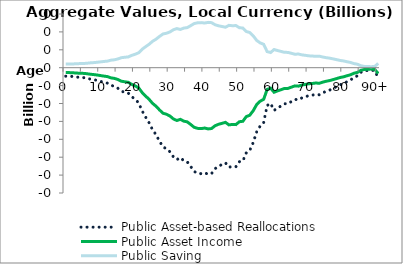
| Category | Public Asset-based Reallocations | Public Asset Income | Public Saving |
|---|---|---|---|
| 0 | -0.949 | -0.545 | 0.404 |
|  | -0.954 | -0.548 | 0.406 |
| 2 | -0.982 | -0.564 | 0.418 |
| 3 | -1.036 | -0.596 | 0.441 |
| 4 | -1.077 | -0.619 | 0.458 |
| 5 | -1.102 | -0.633 | 0.469 |
| 6 | -1.157 | -0.665 | 0.492 |
| 7 | -1.265 | -0.727 | 0.538 |
| 8 | -1.332 | -0.765 | 0.566 |
| 9 | -1.418 | -0.815 | 0.603 |
| 10 | -1.529 | -0.879 | 0.651 |
| 11 | -1.636 | -0.94 | 0.696 |
| 12 | -1.725 | -0.991 | 0.734 |
| 13 | -1.975 | -1.135 | 0.84 |
| 14 | -2.076 | -1.193 | 0.883 |
| 15 | -2.293 | -1.318 | 0.976 |
| 16 | -2.624 | -1.508 | 1.116 |
| 17 | -2.742 | -1.576 | 1.166 |
| 18 | -2.834 | -1.628 | 1.206 |
| 19 | -3.237 | -1.86 | 1.377 |
| 20 | -3.532 | -2.029 | 1.502 |
| 21 | -3.927 | -2.257 | 1.671 |
| 22 | -4.832 | -2.776 | 2.055 |
| 23 | -5.514 | -3.168 | 2.346 |
| 24 | -6.15 | -3.534 | 2.616 |
| 25 | -6.928 | -3.981 | 2.947 |
| 26 | -7.488 | -4.302 | 3.185 |
| 27 | -8.205 | -4.714 | 3.49 |
| 28 | -8.854 | -5.087 | 3.766 |
| 29 | -9.045 | -5.197 | 3.848 |
| 30 | -9.391 | -5.396 | 3.995 |
| 31 | -9.962 | -5.724 | 4.238 |
| 32 | -10.27 | -5.901 | 4.369 |
| 33 | -10.043 | -5.771 | 4.272 |
| 34 | -10.397 | -5.974 | 4.423 |
| 35 | -10.533 | -6.052 | 4.481 |
| 36 | -11.049 | -6.349 | 4.7 |
| 37 | -11.597 | -6.664 | 4.933 |
| 38 | -11.798 | -6.779 | 5.019 |
| 39 | -11.842 | -6.804 | 5.037 |
| 40 | -11.732 | -6.741 | 4.991 |
| 41 | -11.905 | -6.84 | 5.064 |
| 42 | -11.83 | -6.797 | 5.032 |
| 43 | -11.286 | -6.485 | 4.801 |
| 44 | -11.005 | -6.323 | 4.681 |
| 45 | -10.821 | -6.218 | 4.603 |
| 46 | -10.629 | -6.107 | 4.522 |
| 47 | -11.12 | -6.389 | 4.73 |
| 48 | -11.027 | -6.336 | 4.691 |
| 49 | -11.066 | -6.359 | 4.708 |
| 50 | -10.506 | -6.037 | 4.469 |
| 51 | -10.421 | -5.988 | 4.433 |
| 52 | -9.509 | -5.464 | 4.045 |
| 53 | -9.239 | -5.309 | 3.93 |
| 54 | -8.352 | -4.799 | 3.553 |
| 55 | -7.156 | -4.112 | 3.044 |
| 56 | -6.511 | -3.741 | 2.77 |
| 57 | -6.143 | -3.53 | 2.613 |
| 58 | -4.227 | -2.429 | 1.798 |
| 59 | -3.987 | -2.291 | 1.696 |
| 60 | -4.773 | -2.742 | 2.03 |
| 61 | -4.501 | -2.586 | 1.915 |
| 62 | -4.277 | -2.457 | 1.819 |
| 63 | -4.031 | -2.316 | 1.715 |
| 64 | -4.022 | -2.311 | 1.711 |
| 65 | -3.778 | -2.171 | 1.607 |
| 66 | -3.535 | -2.031 | 1.504 |
| 67 | -3.59 | -2.063 | 1.527 |
| 68 | -3.376 | -1.94 | 1.436 |
| 69 | -3.253 | -1.869 | 1.384 |
| 70 | -3.115 | -1.79 | 1.325 |
| 71 | -3.069 | -1.763 | 1.305 |
| 72 | -2.974 | -1.709 | 1.265 |
| 73 | -3.027 | -1.739 | 1.288 |
| 74 | -2.81 | -1.615 | 1.196 |
| 75 | -2.635 | -1.514 | 1.121 |
| 76 | -2.506 | -1.44 | 1.066 |
| 77 | -2.315 | -1.33 | 0.985 |
| 78 | -2.116 | -1.216 | 0.9 |
| 79 | -1.909 | -1.097 | 0.812 |
| 80 | -1.774 | -1.019 | 0.755 |
| 81 | -1.565 | -0.899 | 0.666 |
| 82 | -1.378 | -0.792 | 0.586 |
| 83 | -1.079 | -0.62 | 0.459 |
| 84 | -0.913 | -0.525 | 0.389 |
| 85 | -0.51 | -0.293 | 0.217 |
| 86 | -0.337 | -0.194 | 0.143 |
| 87 | -0.317 | -0.182 | 0.135 |
| 88 | -0.257 | -0.148 | 0.109 |
| 89 | -0.355 | -0.204 | 0.151 |
| 90+ | -1.131 | -0.65 | 0.481 |